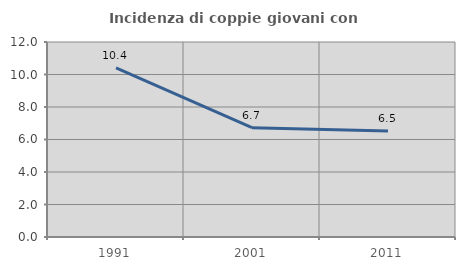
| Category | Incidenza di coppie giovani con figli |
|---|---|
| 1991.0 | 10.414 |
| 2001.0 | 6.726 |
| 2011.0 | 6.518 |